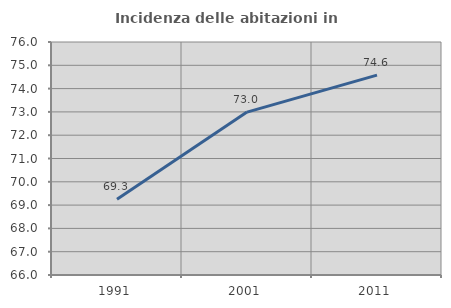
| Category | Incidenza delle abitazioni in proprietà  |
|---|---|
| 1991.0 | 69.254 |
| 2001.0 | 72.992 |
| 2011.0 | 74.58 |